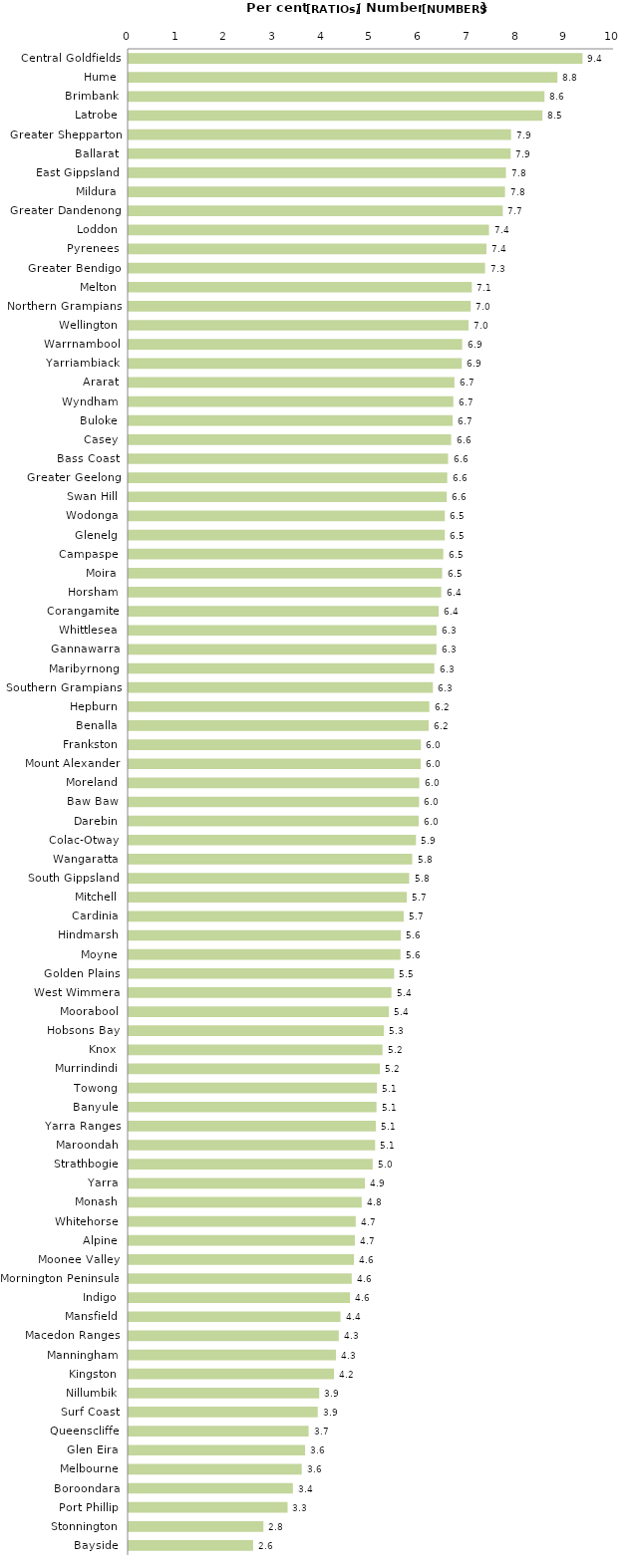
| Category | Series 0 |
|---|---|
| Central Goldfields | 9.351 |
| Hume | 8.834 |
| Brimbank | 8.567 |
| Latrobe | 8.525 |
| Greater Shepparton | 7.879 |
| Ballarat | 7.87 |
| East Gippsland | 7.773 |
| Mildura | 7.754 |
| Greater Dandenong | 7.708 |
| Loddon | 7.424 |
| Pyrenees | 7.372 |
| Greater Bendigo | 7.343 |
| Melton | 7.07 |
| Northern Grampians | 7.048 |
| Wellington | 7.004 |
| Warrnambool | 6.872 |
| Yarriambiack | 6.864 |
| Ararat | 6.712 |
| Wyndham | 6.689 |
| Buloke | 6.676 |
| Casey | 6.644 |
| Bass Coast | 6.581 |
| Greater Geelong | 6.564 |
| Swan Hill | 6.553 |
| Wodonga | 6.514 |
| Glenelg | 6.513 |
| Campaspe | 6.482 |
| Moira | 6.459 |
| Horsham | 6.441 |
| Corangamite | 6.389 |
| Whittlesea | 6.343 |
| Gannawarra | 6.341 |
| Maribyrnong | 6.297 |
| Southern Grampians | 6.269 |
| Hepburn | 6.195 |
| Benalla | 6.181 |
| Frankston | 6.021 |
| Mount Alexander | 6.017 |
| Moreland | 5.988 |
| Baw Baw | 5.984 |
| Darebin | 5.976 |
| Colac-Otway | 5.92 |
| Wangaratta | 5.842 |
| South Gippsland | 5.781 |
| Mitchell | 5.731 |
| Cardinia | 5.666 |
| Hindmarsh | 5.606 |
| Moyne | 5.6 |
| Golden Plains | 5.47 |
| West Wimmera | 5.414 |
| Moorabool | 5.363 |
| Hobsons Bay | 5.259 |
| Knox | 5.23 |
| Murrindindi | 5.175 |
| Towong | 5.116 |
| Banyule | 5.107 |
| Yarra Ranges | 5.092 |
| Maroondah | 5.078 |
| Strathbogie | 5.028 |
| Yarra | 4.868 |
| Monash | 4.801 |
| Whitehorse | 4.679 |
| Alpine | 4.66 |
| Moonee Valley | 4.642 |
| Mornington Peninsula | 4.596 |
| Indigo | 4.561 |
| Mansfield | 4.364 |
| Macedon Ranges | 4.329 |
| Manningham | 4.272 |
| Kingston | 4.232 |
| Nillumbik | 3.927 |
| Surf Coast | 3.896 |
| Queenscliffe | 3.708 |
| Glen Eira | 3.636 |
| Melbourne | 3.567 |
| Boroondara | 3.385 |
| Port Phillip | 3.275 |
| Stonnington | 2.777 |
| Bayside | 2.564 |